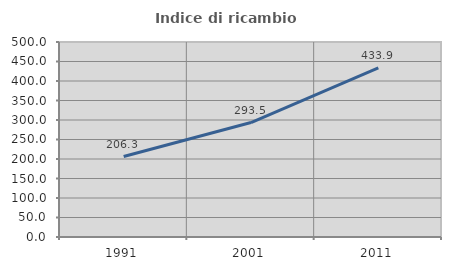
| Category | Indice di ricambio occupazionale  |
|---|---|
| 1991.0 | 206.349 |
| 2001.0 | 293.542 |
| 2011.0 | 433.942 |